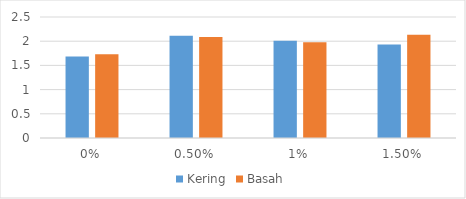
| Category | Kering | Basah |
|---|---|---|
| 0.0 | 1.685 | 1.73 |
| 0.005 | 2.115 | 2.085 |
| 0.01 | 2.01 | 1.978 |
| 0.015 | 1.932 | 2.135 |